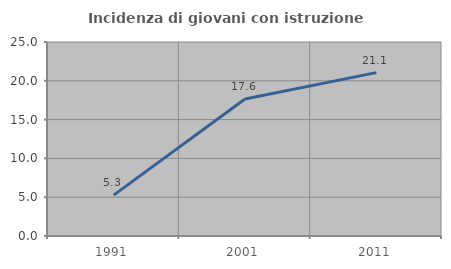
| Category | Incidenza di giovani con istruzione universitaria |
|---|---|
| 1991.0 | 5.263 |
| 2001.0 | 17.647 |
| 2011.0 | 21.053 |